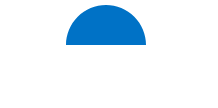
| Category | Series 0 |
|---|---|
| 0 | 0.5 |
| 1 | 0 |
| 2 | 0.5 |